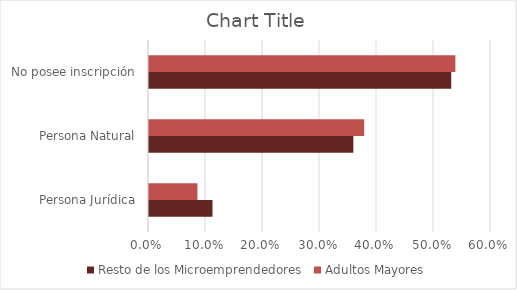
| Category | Resto de los Microemprendedores | Adultos Mayores |
|---|---|---|
| Persona Jurídica | 0.111 | 0.085 |
| Persona Natural | 0.359 | 0.378 |
| No posee inscripción | 0.53 | 0.538 |